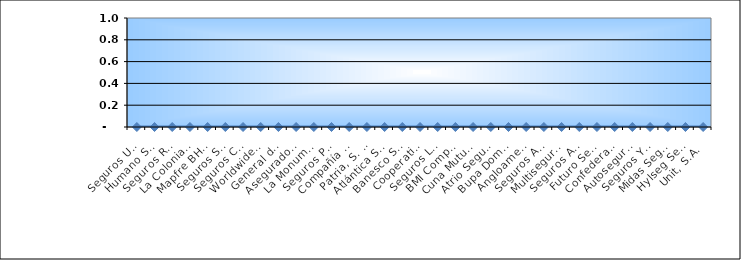
| Category | Series 0 |
|---|---|
| Seguros Universal, S. A. | 0 |
| Humano Seguros, S. A. | 0 |
| Seguros Reservas, S. A. | 0 |
| La Colonial, S. A., Compañia De Seguros | 0 |
| Mapfre BHD Compañía de Seguros | 0 |
| Seguros Sura, S.A. | 0 |
| Seguros Crecer, S. A. | 0 |
| Worldwide Seguros, S. A. | 0 |
| General de Seguros, S. A. | 0 |
| Aseguradora Agropecuaria Dominicana, S. A. | 0 |
| La Monumental de Seguros, S. A. | 0 |
| Seguros Pepín, S. A. | 0 |
| Compañía Dominicana de Seguros, C. por A. | 0 |
| Patria, S. A., Compañía de Seguros | 0 |
| Atlántica Seguros, S. A. | 0 |
| Banesco Seguros | 0 |
| Cooperativa Nacional De Seguros, Inc  | 0 |
| Seguros La Internacional, S. A. | 0 |
| BMI Compañía de Seguros, S. A. | 0 |
| Cuna Mutual Insurance Society Dominicana | 0 |
| Atrio Seguros S. A. | 0 |
| Bupa Dominicana, S. A. | 0 |
| Angloamericana de Seguros, S. A. | 0 |
| Seguros APS, S.R.L. | 0 |
| Multiseguros Su, S.A. | 0 |
| Seguros Ademi, S.A. | 0 |
| Futuro Seguros | 0 |
| Confederación del Canadá Dominicana, S. A. | 0 |
| Autoseguro, S. A. | 0 |
| Seguros Yunen, S.A. | 0 |
| Midas Seguros, S.A. | 0 |
| Hylseg Seguros S.A | 0 |
| Unit, S.A. | 0 |